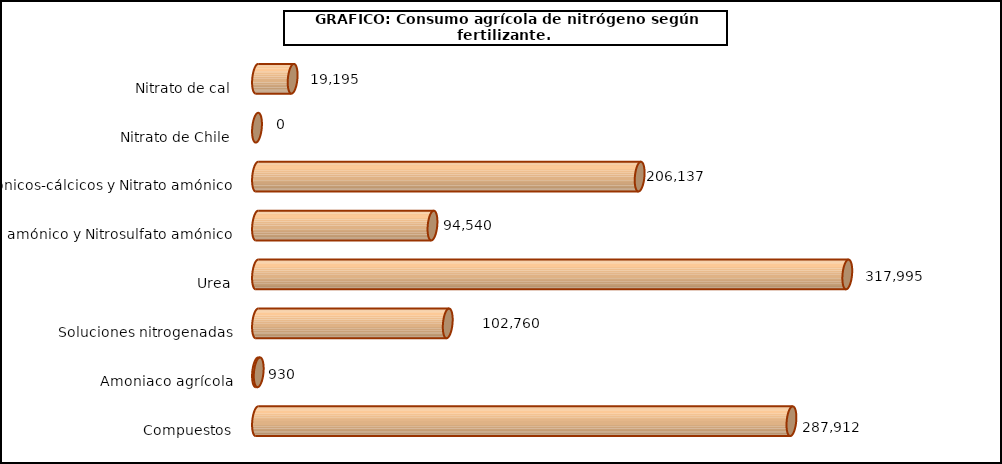
| Category | fert. N |
|---|---|
| 0 | 19195 |
| 1 | 0 |
| 2 | 206137 |
| 3 | 94540 |
| 4 | 317995 |
| 5 | 102760 |
| 6 | 930 |
| 7 | 287912 |